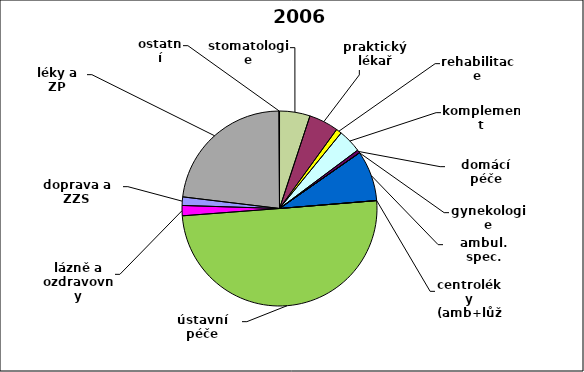
| Category | Series 0 |
|---|---|
| stomatologie | 0.051 |
| praktický lékař | 0.049 |
| rehabilitace | 0.009 |
| komplement | 0.039 |
| domácí péče | 0.005 |
| gynekologie | 0 |
| ambul. spec. | 0.084 |
| centroléky (amb+lůž) | 0 |
| ústavní péče | 0.501 |
| lázně a ozdravovny | 0.017 |
| doprava a ZZS | 0.014 |
| léky a ZP | 0.23 |
| ostatní | 0.001 |